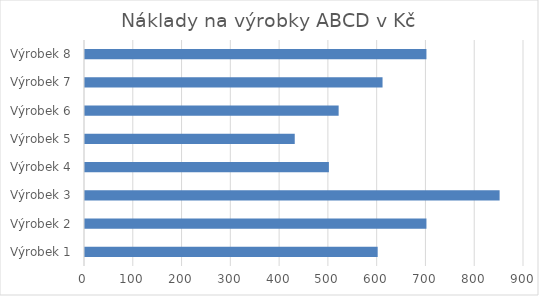
| Category | Cena materiál |
|---|---|
| Výrobek 1 | 600 |
| Výrobek 2 | 700 |
| Výrobek 3 | 850 |
| Výrobek 4 | 500 |
| Výrobek 5 | 430 |
| Výrobek 6 | 520 |
| Výrobek 7 | 610 |
| Výrobek 8 | 700 |